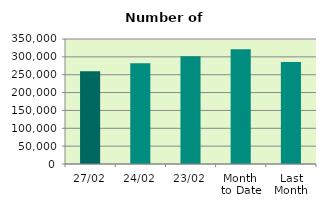
| Category | Series 0 |
|---|---|
| 27/02 | 259404 |
| 24/02 | 282290 |
| 23/02 | 301586 |
| Month 
to Date | 321373.053 |
| Last
Month | 285405.636 |